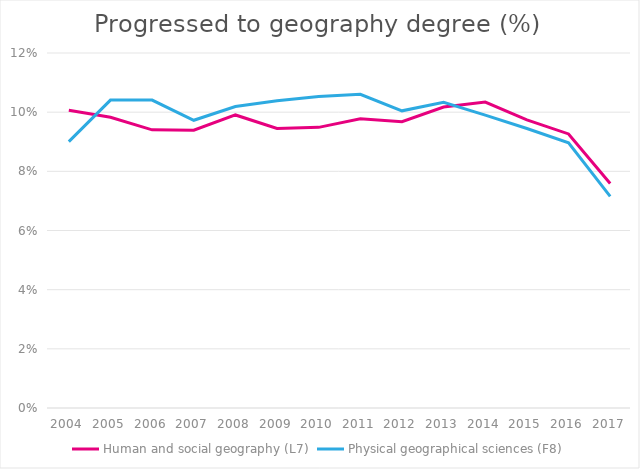
| Category | Human and social geography (L7) | Physical geographical sciences (F8) |
|---|---|---|
| 2004.0 | 0.101 | 0.09 |
| 2005.0 | 0.098 | 0.104 |
| 2006.0 | 0.094 | 0.104 |
| 2007.0 | 0.094 | 0.097 |
| 2008.0 | 0.099 | 0.102 |
| 2009.0 | 0.095 | 0.104 |
| 2010.0 | 0.095 | 0.105 |
| 2011.0 | 0.098 | 0.106 |
| 2012.0 | 0.097 | 0.1 |
| 2013.0 | 0.102 | 0.103 |
| 2014.0 | 0.103 | 0.099 |
| 2015.0 | 0.097 | 0.094 |
| 2016.0 | 0.093 | 0.09 |
| 2017.0 | 0.076 | 0.072 |